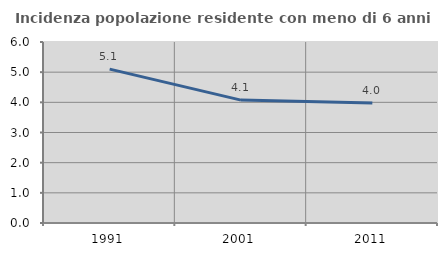
| Category | Incidenza popolazione residente con meno di 6 anni |
|---|---|
| 1991.0 | 5.101 |
| 2001.0 | 4.074 |
| 2011.0 | 3.975 |